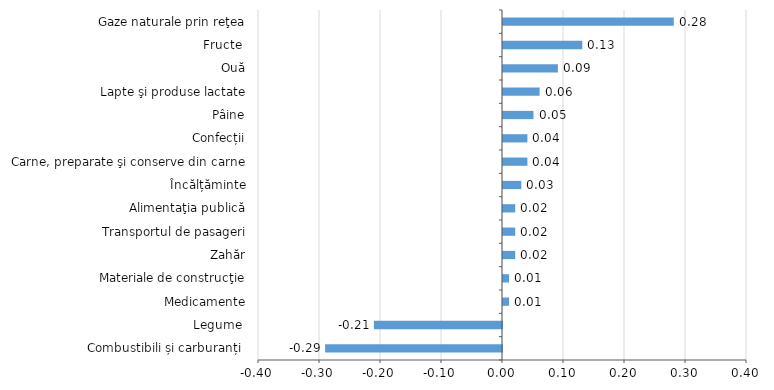
| Category |  gradul de influență  (+/-) asupra IPC, %  |
|---|---|
| Combustibili și carburanți  | -0.29 |
| Legume  | -0.21 |
| Medicamente | 0.01 |
| Materiale de construcţie | 0.01 |
| Zahăr | 0.02 |
| Transportul de pasageri | 0.02 |
| Alimentaţia publică | 0.02 |
| Încălțăminte | 0.03 |
| Carne, preparate şi conserve din carne | 0.04 |
| Confecții | 0.04 |
| Pâine | 0.05 |
| Lapte şi produse lactate | 0.06 |
| Ouă | 0.09 |
| Fructe  | 0.13 |
| Gaze naturale prin reţea | 0.28 |